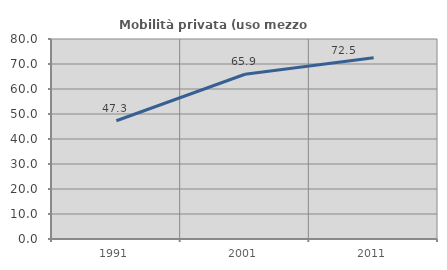
| Category | Mobilità privata (uso mezzo privato) |
|---|---|
| 1991.0 | 47.304 |
| 2001.0 | 65.909 |
| 2011.0 | 72.53 |